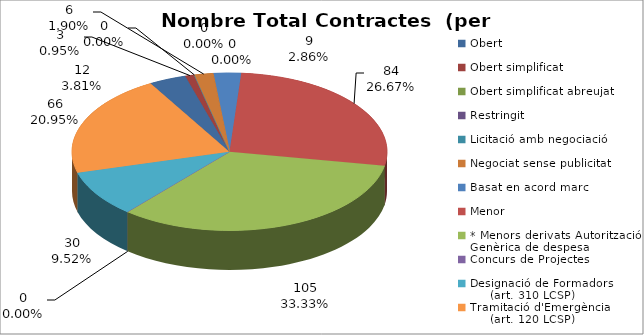
| Category | Nombre Total Contractes |
|---|---|
| Obert | 12 |
| Obert simplificat | 3 |
| Obert simplificat abreujat | 0 |
| Restringit | 0 |
| Licitació amb negociació | 0 |
| Negociat sense publicitat | 6 |
| Basat en acord marc | 9 |
| Menor | 84 |
| * Menors derivats Autorització Genèrica de despesa | 105 |
| Concurs de Projectes | 0 |
| Designació de Formadors
     (art. 310 LCSP) | 30 |
| Tramitació d'Emergència
     (art. 120 LCSP) | 66 |